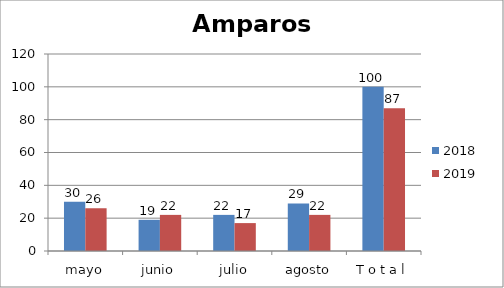
| Category | 2018 | 2019 |
|---|---|---|
| mayo | 30 | 26 |
| junio | 19 | 22 |
| julio | 22 | 17 |
| agosto | 29 | 22 |
| T o t a l | 100 | 87 |